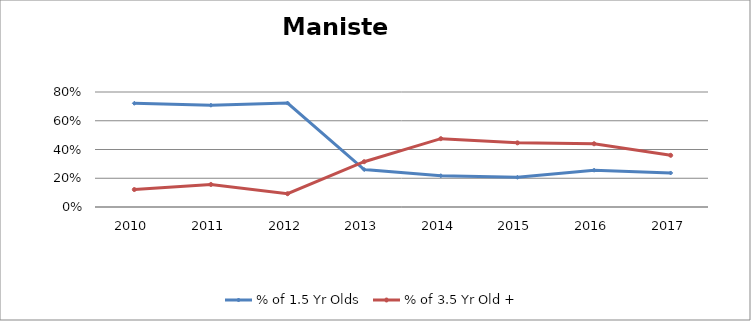
| Category | % of 1.5 Yr Olds | % of 3.5 Yr Old + |
|---|---|---|
| 2010.0 | 0.721 | 0.121 |
| 2011.0 | 0.708 | 0.157 |
| 2012.0 | 0.723 | 0.092 |
| 2013.0 | 0.26 | 0.315 |
| 2014.0 | 0.218 | 0.475 |
| 2015.0 | 0.207 | 0.446 |
| 2016.0 | 0.256 | 0.44 |
| 2017.0 | 0.237 | 0.36 |